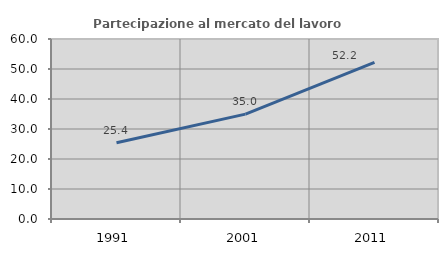
| Category | Partecipazione al mercato del lavoro  femminile |
|---|---|
| 1991.0 | 25.41 |
| 2001.0 | 34.951 |
| 2011.0 | 52.222 |